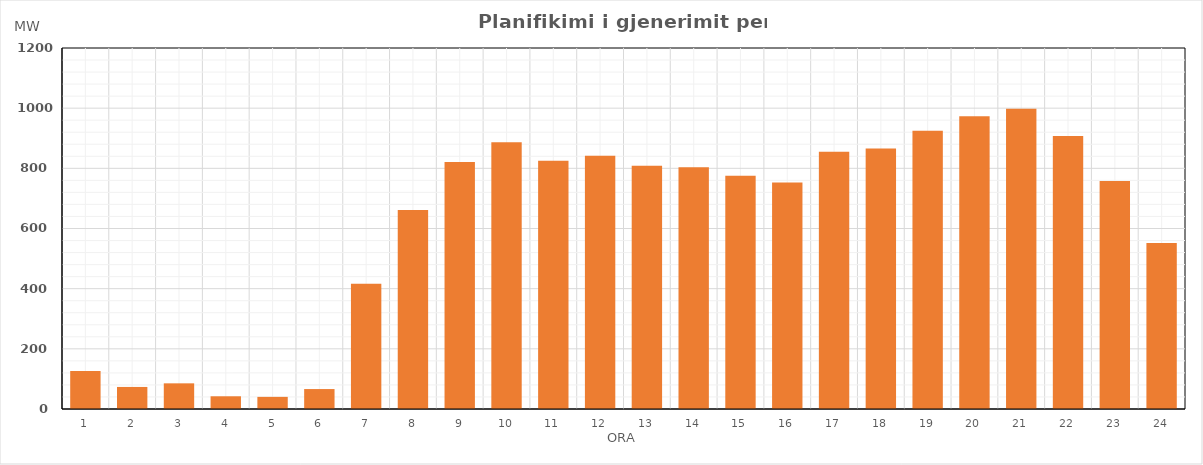
| Category | Max (MW) |
|---|---|
| 0 | 126.3 |
| 1 | 73.3 |
| 2 | 85.3 |
| 3 | 42.3 |
| 4 | 40.3 |
| 5 | 66.3 |
| 6 | 416.3 |
| 7 | 661.087 |
| 8 | 820.939 |
| 9 | 886.389 |
| 10 | 825.509 |
| 11 | 841.599 |
| 12 | 808.465 |
| 13 | 803.373 |
| 14 | 775.183 |
| 15 | 753.121 |
| 16 | 855.055 |
| 17 | 866.09 |
| 18 | 925.32 |
| 19 | 973.523 |
| 20 | 997.707 |
| 21 | 907.378 |
| 22 | 757.737 |
| 23 | 551.975 |